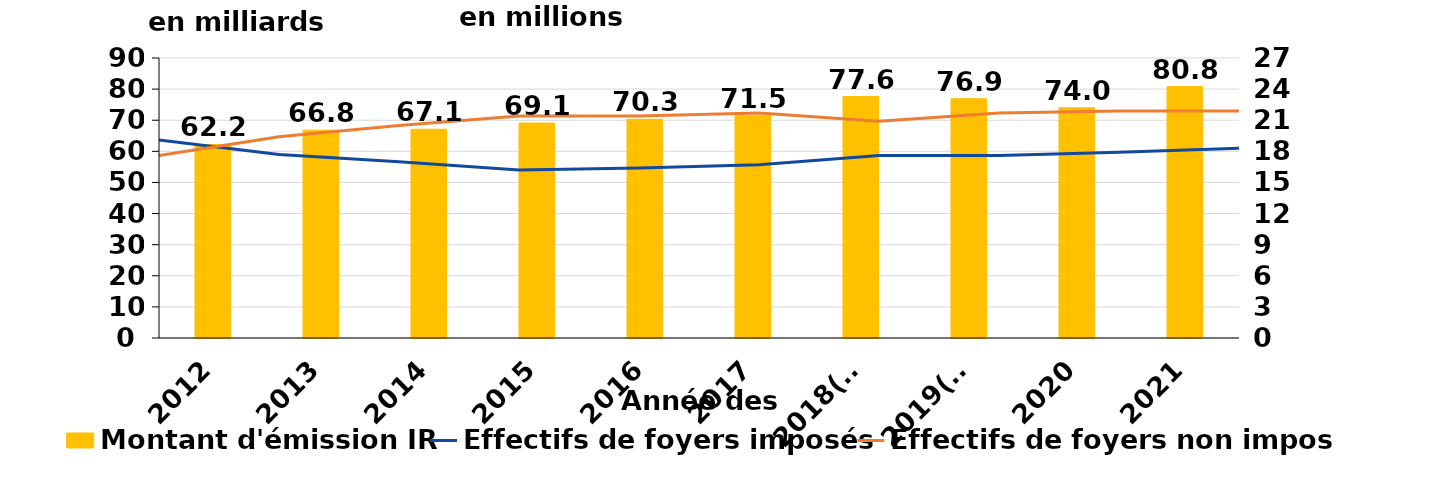
| Category | Montant d'émission IR |
|---|---|
| 2012 | 62.2 |
| 2013 | 66.8 |
| 2014 | 67.1 |
| 2015 | 69.1 |
| 2016 | 70.3 |
| 2017 | 71.5 |
| 2018(*) | 77.6 |
| 2019(*) | 76.9 |
| 2020 | 74 |
| 2021 | 80.8 |